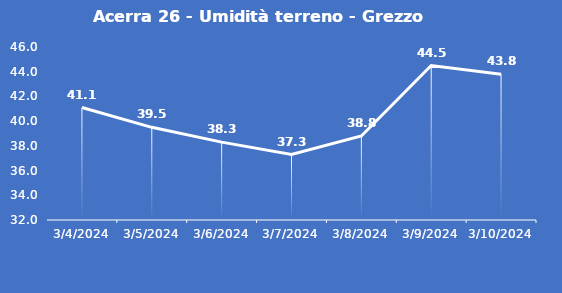
| Category | Acerra 26 - Umidità terreno - Grezzo (%VWC) |
|---|---|
| 3/4/24 | 41.1 |
| 3/5/24 | 39.5 |
| 3/6/24 | 38.3 |
| 3/7/24 | 37.3 |
| 3/8/24 | 38.8 |
| 3/9/24 | 44.5 |
| 3/10/24 | 43.8 |